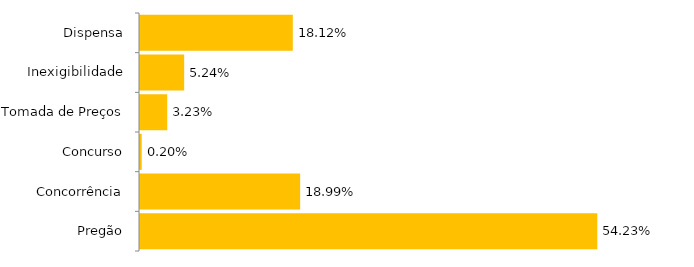
| Category | Series 0 |
|---|---|
| Pregão | 0.542 |
| Concorrência | 0.19 |
| Concurso | 0.002 |
| Tomada de Preços | 0.032 |
| Inexigibilidade | 0.052 |
| Dispensa | 0.181 |